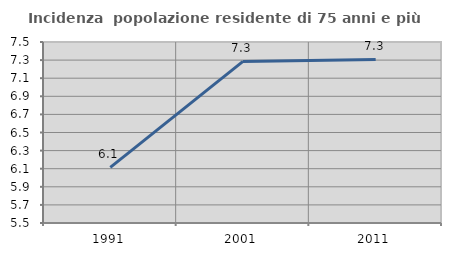
| Category | Incidenza  popolazione residente di 75 anni e più |
|---|---|
| 1991.0 | 6.115 |
| 2001.0 | 7.286 |
| 2011.0 | 7.307 |